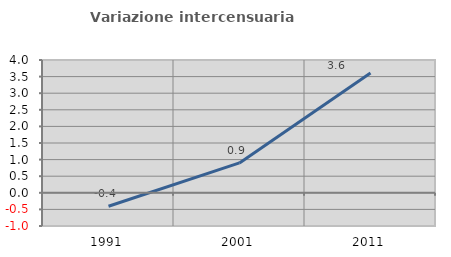
| Category | Variazione intercensuaria annua |
|---|---|
| 1991.0 | -0.404 |
| 2001.0 | 0.9 |
| 2011.0 | 3.609 |